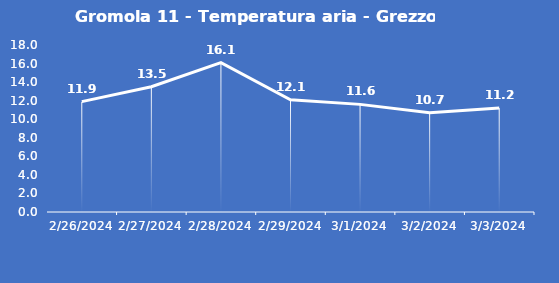
| Category | Gromola 11 - Temperatura aria - Grezzo (°C) |
|---|---|
| 2/26/24 | 11.9 |
| 2/27/24 | 13.5 |
| 2/28/24 | 16.1 |
| 2/29/24 | 12.1 |
| 3/1/24 | 11.6 |
| 3/2/24 | 10.7 |
| 3/3/24 | 11.2 |